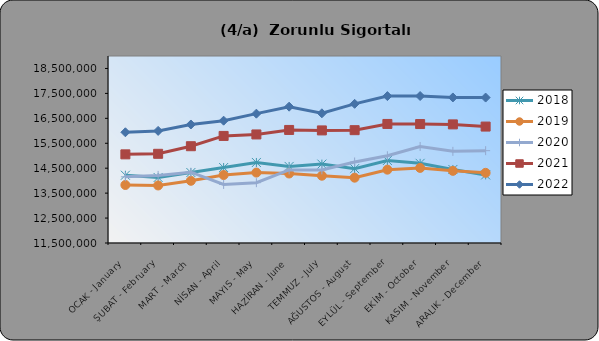
| Category | 2018 | 2019 | 2020 | 2021 | 2022 |
|---|---|---|---|---|---|
| OCAK - January | 14218231 | 13826757 | 14154168 | 15055602 | 15940624 |
| ŞUBAT - February | 14127524 | 13807689 | 14211588 | 15077515 | 15996438 |
| MART - March | 14325806 | 13994899 | 14339304 | 15381821 | 16252858 |
| NİSAN - April | 14527332 | 14226393 | 13847835 | 15794188 | 16405802 |
| MAYIS - May | 14729306 | 14324472 | 13919211 | 15853614 | 16687567 |
| HAZİRAN - June | 14570283 | 14287607 | 14431133 | 16033979 | 16968248 |
| TEMMUZ - July | 14664384 | 14198097 | 14432781 | 16015524 | 16701928 |
| AĞUSTOS - August | 14482653 | 14119665 | 14749189 | 16025300 | 17081431 |
| EYLÜL - September | 14809349 | 14440956 | 14998852 | 16275150 | 17391504 |
| EKİM - October | 14695062 | 14511611 | 15371347 | 16270696 | 17393928 |
| KASIM - November | 14448590 | 14393707 | 15175670 | 16257219 | 17337901 |
| ARALIK - December | 14229170 | 14314313 | 15203423 | 16169679 | 17332991 |